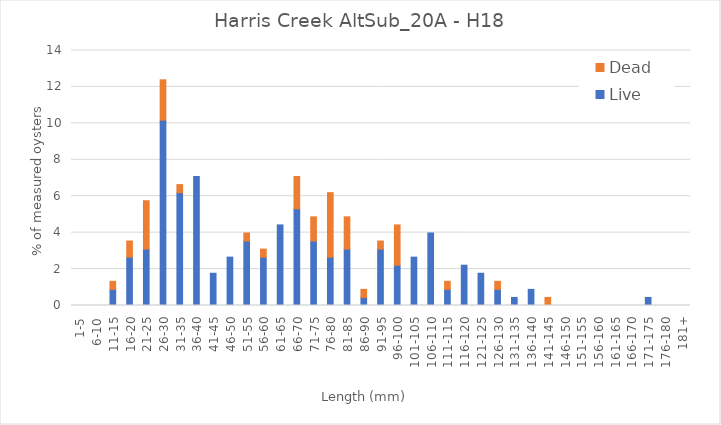
| Category | Live | Dead |
|---|---|---|
| 1-5 | 0 | 0 |
| 6-10 | 0 | 0 |
| 11-15 | 0.885 | 0.442 |
| 16-20 | 2.655 | 0.885 |
| 21-25 | 3.097 | 2.655 |
| 26-30 | 10.177 | 2.212 |
| 31-35 | 6.195 | 0.442 |
| 36-40 | 7.08 | 0 |
| 41-45 | 1.77 | 0 |
| 46-50 | 2.655 | 0 |
| 51-55 | 3.54 | 0.442 |
| 56-60 | 2.655 | 0.442 |
| 61-65 | 4.425 | 0 |
| 66-70 | 5.31 | 1.77 |
| 71-75 | 3.54 | 1.327 |
| 76-80 | 2.655 | 3.54 |
| 81-85 | 3.097 | 1.77 |
| 86-90 | 0.442 | 0.442 |
| 91-95 | 3.097 | 0.442 |
| 96-100 | 2.212 | 2.212 |
| 101-105 | 2.655 | 0 |
| 106-110 | 3.982 | 0 |
| 111-115 | 0.885 | 0.442 |
| 116-120 | 2.212 | 0 |
| 121-125 | 1.77 | 0 |
| 126-130 | 0.885 | 0.442 |
| 131-135 | 0.442 | 0 |
| 136-140 | 0.885 | 0 |
| 141-145 | 0 | 0.442 |
| 146-150 | 0 | 0 |
| 151-155 | 0 | 0 |
| 156-160 | 0 | 0 |
| 161-165 | 0 | 0 |
| 166-170 | 0 | 0 |
| 171-175 | 0.442 | 0 |
| 176-180 | 0 | 0 |
| 181+ | 0 | 0 |